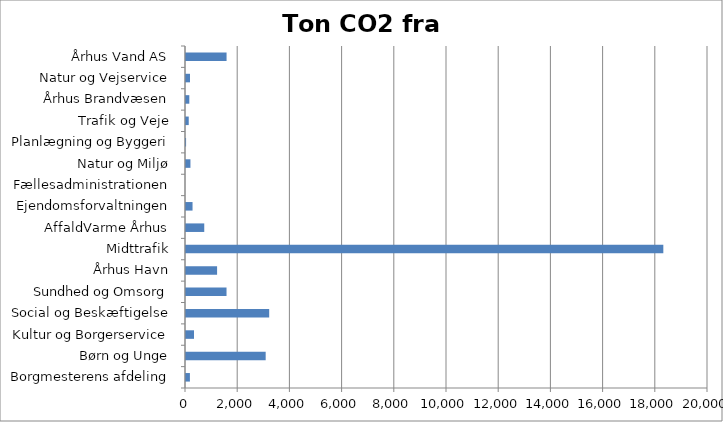
| Category | Ton CO2 |
|---|---|
| Borgmesterens afdeling | 149.789 |
| Børn og Unge | 3052.592 |
| Kultur og Borgerservice | 307.38 |
| Social og Beskæftigelse | 3187.406 |
| Sundhed og Omsorg | 1552.631 |
| Århus Havn | 1191.143 |
| Midttrafik | 18288.215 |
| AffaldVarme Århus | 699.306 |
| Ejendomsforvaltningen | 250.54 |
| Fællesadministrationen | 0 |
| Natur og Miljø | 170.183 |
| Planlægning og Byggeri | 2.921 |
| Trafik og Veje | 104.903 |
| Århus Brandvæsen | 127.184 |
| Natur og Vejservice | 152.44 |
| Århus Vand AS | 1554.284 |